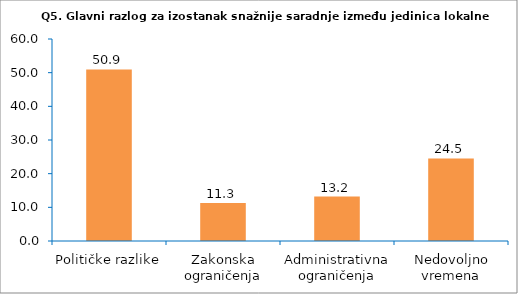
| Category | Series 0 |
|---|---|
| Političke razlike | 50.943 |
| Zakonska ograničenja | 11.321 |
| Administrativna ograničenja | 13.208 |
| Nedovoljno vremena | 24.528 |